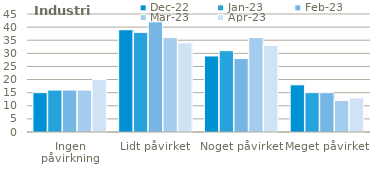
| Category | dec-22 | jan-23 | feb-23 | mar-23 | apr-23 |
|---|---|---|---|---|---|
| Ingen påvirkning | 15 | 16 | 16 | 16 | 20 |
| Lidt påvirket | 39 | 38 | 42 | 36 | 34 |
| Noget påvirket | 29 | 31 | 28 | 36 | 33 |
| Meget påvirket | 18 | 15 | 15 | 12 | 13 |